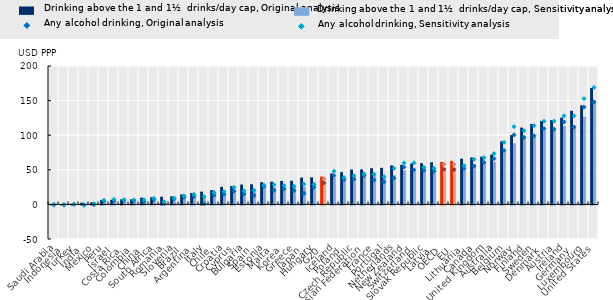
| Category | Drinking above the 1 and 1½  drinks/day cap, Original analysis | Drinking above the 1 and 1½  drinks/day cap, Sensitivity analysis |
|---|---|---|
| Saudi Arabia | 0.107 | 0.023 |
| Indonesia | 0.393 | 0.001 |
| Turkey | 0.978 | 0.562 |
| India | 2.452 | 0.468 |
| Mexico | 3.02 | 1.519 |
| Peru | 6.515 | 5.492 |
| Israel | 6.589 | 5.136 |
| Costa Rica | 7.308 | 6.219 |
| Colombia | 7.483 | 6.341 |
| China | 9.77 | 6.894 |
| South Africa | 10.362 | 8.579 |
| Romania | 11.067 | 6.129 |
| Slovenia | 11.65 | 10.26 |
| Brazil | 14.49 | 12.013 |
| Argentina | 16.468 | 13.569 |
| Italy | 18.458 | 9.71 |
| Chile | 20.684 | 16.892 |
| Croatia | 25.354 | 19.884 |
| Cyprus | 26.628 | 21.122 |
| Bulgaria | 28.723 | 21.559 |
| Spain | 29.144 | 19.393 |
| Estonia | 32.089 | 28.374 |
| Malta | 32.866 | 24.88 |
| Korea | 33.909 | 26.308 |
| Greece | 34.203 | 25.437 |
| Japan | 38.765 | 25.274 |
| Hungary | 39.116 | 32.169 |
| G20 | 40.229 | 33.428 |
| Iceland | 44.728 | 38.289 |
| Poland | 46.6 | 39.954 |
| Czech Republic | 50.448 | 40.857 |
| Russian Federation | 50.567 | 44.655 |
| France | 52.32 | 43.135 |
| Portugal | 52.877 | 40.763 |
| Netherlands | 56.353 | 42.276 |
| New Zealand | 57.172 | 49.251 |
| Switzerland | 59.121 | 47.266 |
| Slovak Republic | 59.677 | 52.514 |
| Latvia | 60.896 | 53.281 |
| OECD | 61.353 | 52.099 |
| EU | 62.933 | 53.105 |
| Lithuania | 66.003 | 57.354 |
| Canada | 67.81 | 58.123 |
| United Kingdom | 68.994 | 60.757 |
| Australia | 71.929 | 61.526 |
| Belgium | 91.238 | 77.845 |
| Norway | 100.109 | 88.144 |
| Finland | 111.026 | 98.541 |
| Sweden | 116.201 | 100.1 |
| Denmark | 120.623 | 106.544 |
| Austria | 121.862 | 107.511 |
| Ireland | 125.461 | 113.355 |
| Germany | 135.298 | 114.109 |
| Luxembourg | 143.008 | 126.769 |
| United States | 168.26 | 147.913 |